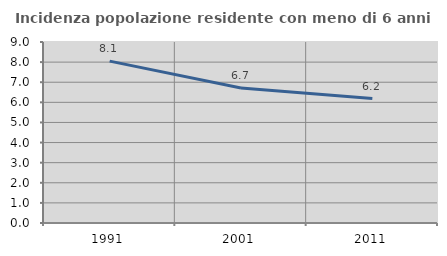
| Category | Incidenza popolazione residente con meno di 6 anni |
|---|---|
| 1991.0 | 8.05 |
| 2001.0 | 6.715 |
| 2011.0 | 6.186 |